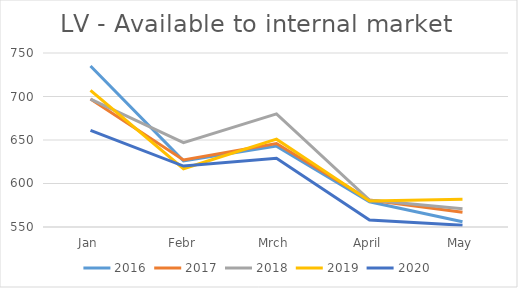
| Category | 2016 | 2017 | 2018 | 2019 | 2020 |
|---|---|---|---|---|---|
| Jan | 735 | 697 | 697 | 707 | 661 |
| Febr | 626 | 627 | 647 | 617 | 620 |
| Mrch | 643 | 646 | 680 | 651 | 629 |
| April | 579 | 581 | 581 | 580 | 558 |
| May | 556 | 567 | 571 | 582 | 552 |